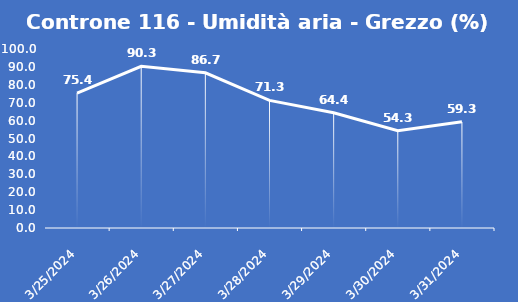
| Category | Controne 116 - Umidità aria - Grezzo (%) |
|---|---|
| 3/25/24 | 75.4 |
| 3/26/24 | 90.3 |
| 3/27/24 | 86.7 |
| 3/28/24 | 71.3 |
| 3/29/24 | 64.4 |
| 3/30/24 | 54.3 |
| 3/31/24 | 59.3 |